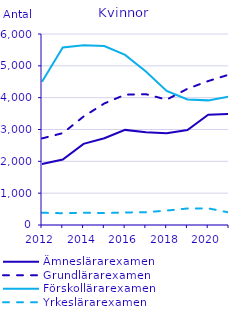
| Category | Ämneslärarexamen                                   | Grundlärarexamen                                   | Förskollärarexamen                                 | Yrkeslärarexamen                                   |
|---|---|---|---|---|
| 2012 | 1917 | 2720 | 4499 | 385 |
| 2013 | 2058 | 2885 | 5574 | 370 |
| 2014 | 2548 | 3407 | 5645 | 385 |
| 2015 | 2724 | 3818 | 5622 | 374 |
| 2016 | 2988 | 4093 | 5345 | 395 |
| 2017 | 2912 | 4110 | 4821 | 400 |
| 2018 | 2883 | 3938 | 4211 | 454 |
| 2019 | 2985 | 4279 | 3944 | 518 |
| 2020 | 3462 | 4522 | 3915 | 522 |
| 2021 | 3492 | 4724 | 4032 | 394 |